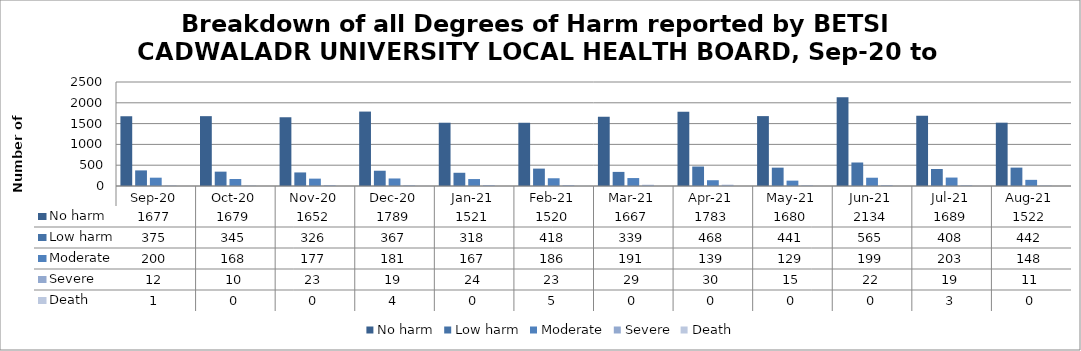
| Category | No harm | Low harm | Moderate | Severe | Death |
|---|---|---|---|---|---|
| Sep-20 | 1677 | 375 | 200 | 12 | 1 |
| Oct-20 | 1679 | 345 | 168 | 10 | 0 |
| Nov-20 | 1652 | 326 | 177 | 23 | 0 |
| Dec-20 | 1789 | 367 | 181 | 19 | 4 |
| Jan-21 | 1521 | 318 | 167 | 24 | 0 |
| Feb-21 | 1520 | 418 | 186 | 23 | 5 |
| Mar-21 | 1667 | 339 | 191 | 29 | 0 |
| Apr-21 | 1783 | 468 | 139 | 30 | 0 |
| May-21 | 1680 | 441 | 129 | 15 | 0 |
| Jun-21 | 2134 | 565 | 199 | 22 | 0 |
| Jul-21 | 1689 | 408 | 203 | 19 | 3 |
| Aug-21 | 1522 | 442 | 148 | 11 | 0 |